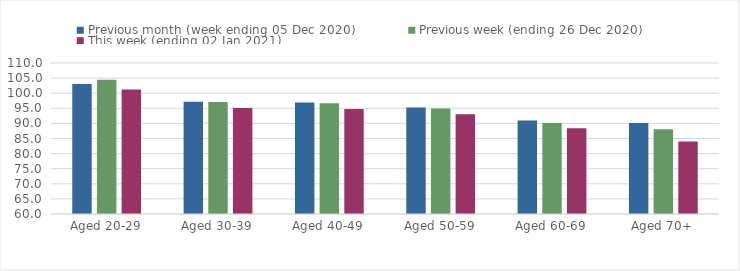
| Category | Previous month (week ending 05 Dec 2020) | Previous week (ending 26 Dec 2020) | This week (ending 02 Jan 2021) |
|---|---|---|---|
| Aged 20-29 | 103.03 | 104.47 | 101.2 |
| Aged 30-39 | 97.13 | 97.09 | 95.08 |
| Aged 40-49 | 96.95 | 96.71 | 94.73 |
| Aged 50-59 | 95.3 | 94.96 | 93.03 |
| Aged 60-69 | 90.95 | 90.1 | 88.36 |
| Aged 70+ | 90.17 | 88.1 | 83.97 |